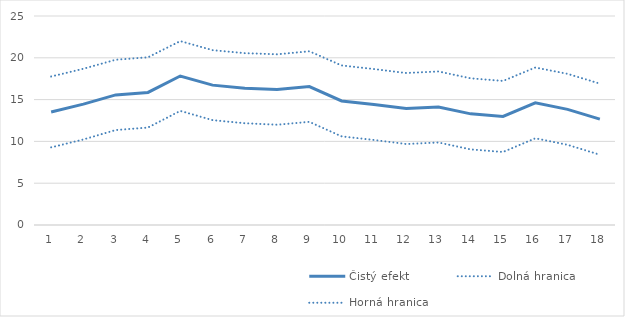
| Category | Čistý efekt | Dolná hranica | Horná hranica |
|---|---|---|---|
| 1.0 | 13.524 | 9.288 | 17.761 |
| 2.0 | 14.461 | 10.233 | 18.69 |
| 3.0 | 15.563 | 11.358 | 19.767 |
| 4.0 | 15.857 | 11.655 | 20.059 |
| 5.0 | 17.824 | 13.652 | 21.996 |
| 6.0 | 16.732 | 12.545 | 20.918 |
| 7.0 | 16.364 | 12.172 | 20.557 |
| 8.0 | 16.206 | 11.994 | 20.417 |
| 9.0 | 16.559 | 12.338 | 20.78 |
| 10.0 | 14.841 | 10.6 | 19.083 |
| 11.0 | 14.414 | 10.174 | 18.653 |
| 12.0 | 13.934 | 9.685 | 18.182 |
| 13.0 | 14.119 | 9.871 | 18.366 |
| 14.0 | 13.294 | 9.044 | 17.544 |
| 15.0 | 12.982 | 8.733 | 17.231 |
| 16.0 | 14.605 | 10.373 | 18.837 |
| 17.0 | 13.835 | 9.59 | 18.081 |
| 18.0 | 12.657 | 8.401 | 16.912 |